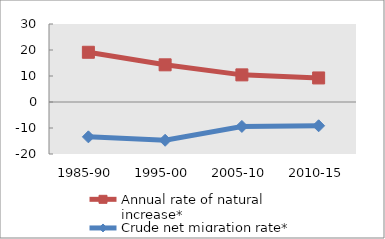
| Category | Annual rate of natural increase* | Crude net migration rate* |
|---|---|---|
| 1985-90 | 19.124 | -13.403 |
| 1995-00 | 14.301 | -14.717 |
| 2005-10 | 10.435 | -9.395 |
| 2010-15 | 9.251 | -9.145 |